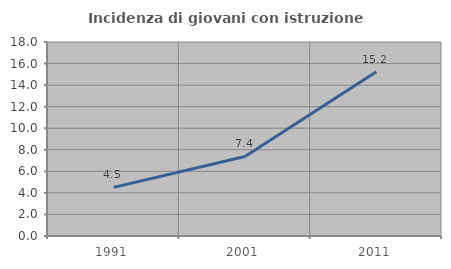
| Category | Incidenza di giovani con istruzione universitaria |
|---|---|
| 1991.0 | 4.511 |
| 2001.0 | 7.383 |
| 2011.0 | 15.238 |